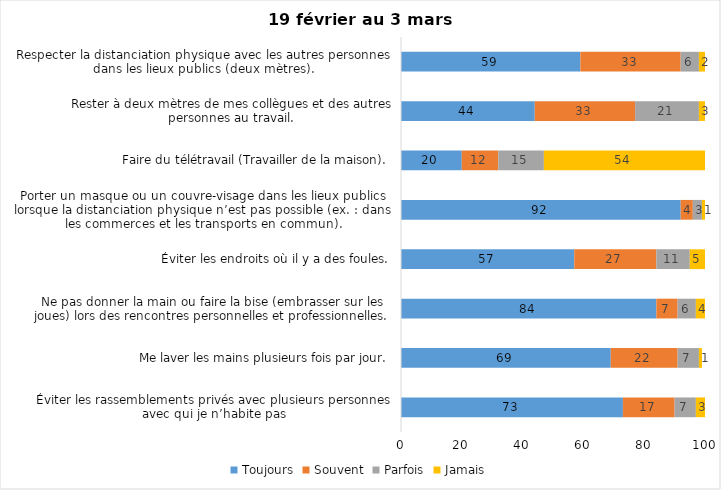
| Category | Toujours | Souvent | Parfois | Jamais |
|---|---|---|---|---|
| Éviter les rassemblements privés avec plusieurs personnes avec qui je n’habite pas | 73 | 17 | 7 | 3 |
| Me laver les mains plusieurs fois par jour. | 69 | 22 | 7 | 1 |
| Ne pas donner la main ou faire la bise (embrasser sur les joues) lors des rencontres personnelles et professionnelles. | 84 | 7 | 6 | 4 |
| Éviter les endroits où il y a des foules. | 57 | 27 | 11 | 5 |
| Porter un masque ou un couvre-visage dans les lieux publics lorsque la distanciation physique n’est pas possible (ex. : dans les commerces et les transports en commun). | 92 | 4 | 3 | 1 |
| Faire du télétravail (Travailler de la maison). | 20 | 12 | 15 | 54 |
| Rester à deux mètres de mes collègues et des autres personnes au travail. | 44 | 33 | 21 | 3 |
| Respecter la distanciation physique avec les autres personnes dans les lieux publics (deux mètres). | 59 | 33 | 6 | 2 |